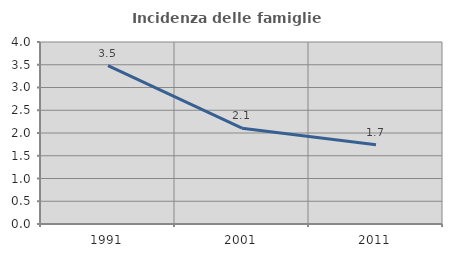
| Category | Incidenza delle famiglie numerose |
|---|---|
| 1991.0 | 3.48 |
| 2001.0 | 2.106 |
| 2011.0 | 1.741 |